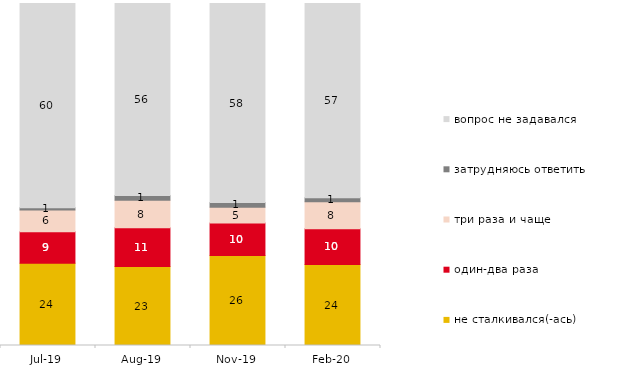
| Category | не сталкивался(-ась) | один-два раза | три раза и чаще | затрудняюсь ответить | вопрос не задавался |
|---|---|---|---|---|---|
| 2019-07-01 | 24.059 | 9.208 | 6.386 | 0.594 | 59.752 |
| 2019-08-01 | 23.077 | 11.339 | 8.042 | 1.399 | 56.144 |
| 2019-11-01 | 26.337 | 9.505 | 4.604 | 1.337 | 58.218 |
| 2020-02-01 | 23.663 | 10.495 | 7.871 | 1.188 | 56.782 |